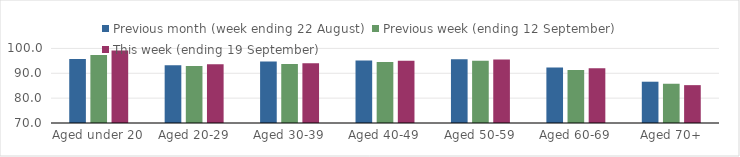
| Category | Previous month (week ending 22 August) | Previous week (ending 12 September) | This week (ending 19 September) |
|---|---|---|---|
| Aged under 20 | 95.7 | 97.36 | 99.14 |
| Aged 20-29 | 93.28 | 92.98 | 93.59 |
| Aged 30-39 | 94.74 | 93.75 | 94.01 |
| Aged 40-49 | 95.19 | 94.5 | 95.05 |
| Aged 50-59 | 95.64 | 95.06 | 95.52 |
| Aged 60-69 | 92.36 | 91.36 | 92.06 |
| Aged 70+ | 86.61 | 85.79 | 85.23 |